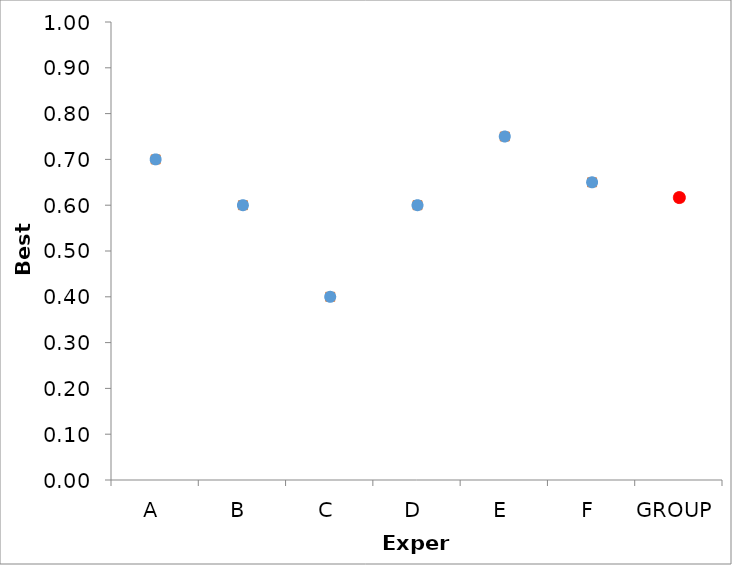
| Category | Series 1 | Series 0 |
|---|---|---|
| A | 0.7 | 0.7 |
| B | 0.6 | 0.6 |
| C | 0.4 | 0.4 |
| D | 0.6 | 0.6 |
| E | 0.75 | 0.75 |
| F | 0.65 | 0.65 |
| GROUP | 0.617 | 0.617 |